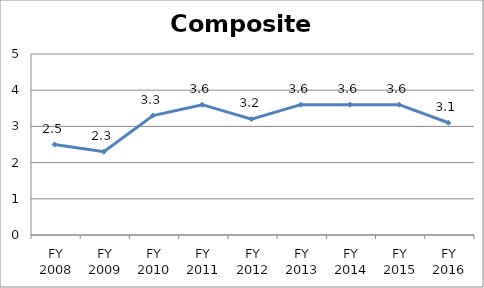
| Category | Composite score |
|---|---|
| FY 2016 | 3.1 |
| FY 2015 | 3.6 |
| FY 2014 | 3.6 |
| FY 2013 | 3.6 |
| FY 2012 | 3.2 |
| FY 2011 | 3.6 |
| FY 2010 | 3.3 |
| FY 2009 | 2.3 |
| FY 2008 | 2.5 |